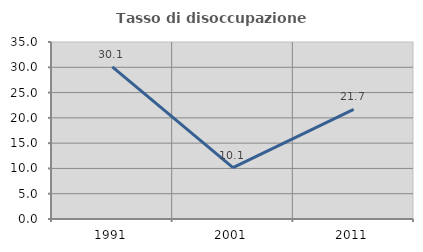
| Category | Tasso di disoccupazione giovanile  |
|---|---|
| 1991.0 | 30.065 |
| 2001.0 | 10.145 |
| 2011.0 | 21.667 |